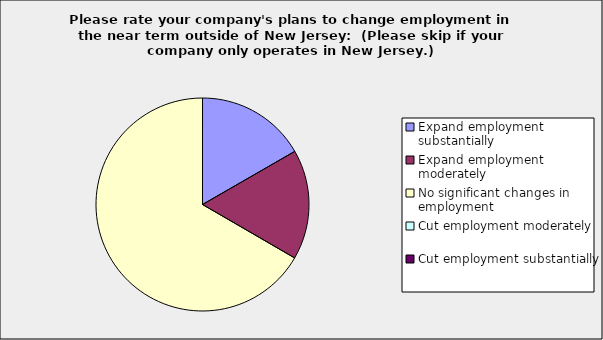
| Category | Series 0 |
|---|---|
| Expand employment substantially | 0.167 |
| Expand employment moderately | 0.167 |
| No significant changes in employment | 0.667 |
| Cut employment moderately | 0 |
| Cut employment substantially | 0 |